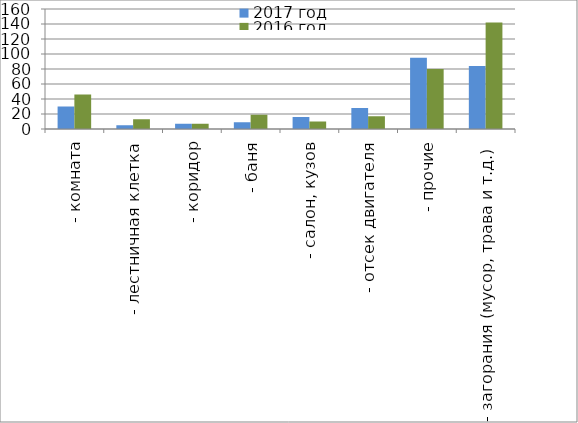
| Category | 2017 год | 2016 год |
|---|---|---|
|  - комната | 30 | 46 |
|  - лестничная клетка | 5 | 13 |
|  - коридор | 7 | 7 |
|  - баня | 9 | 19 |
|  - салон, кузов | 16 | 10 |
|  - отсек двигателя | 28 | 17 |
| - прочие | 95 | 80 |
| - загорания (мусор, трава и т.д.)  | 84 | 142 |